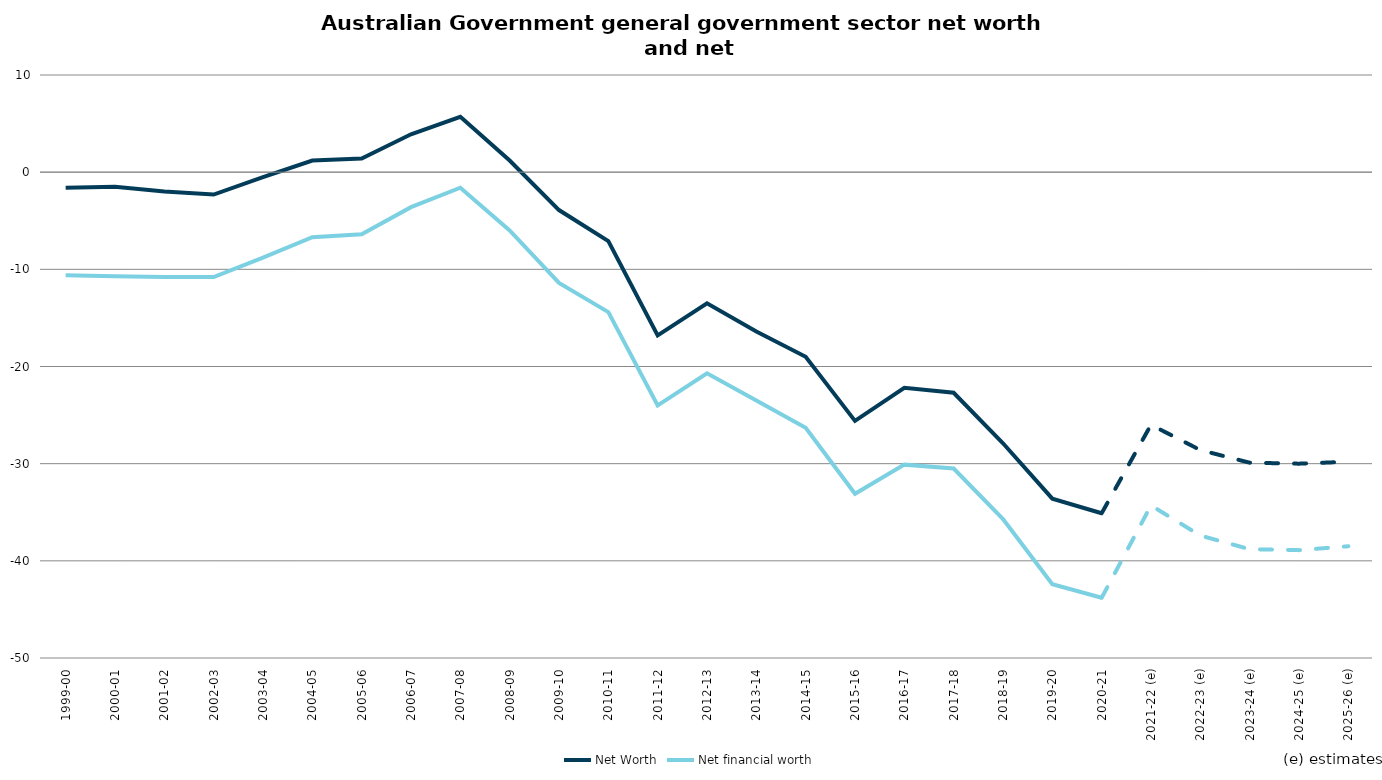
| Category | Net Worth | Net financial worth |
|---|---|---|
| 1999-00 | -1.6 | -10.6 |
| 2000-01 | -1.5 | -10.7 |
| 2001-02 | -2 | -10.8 |
| 2002-03 | -2.3 | -10.8 |
| 2003-04 | -0.5 | -8.8 |
| 2004-05 | 1.2 | -6.7 |
| 2005-06 | 1.4 | -6.4 |
| 2006-07 | 3.9 | -3.6 |
| 2007-08 | 5.7 | -1.6 |
| 2008-09 | 1.2 | -6 |
| 2009-10 | -3.9 | -11.4 |
| 2010-11 | -7.1 | -14.4 |
| 2011-12 | -16.8 | -24 |
| 2012-13 | -13.5 | -20.7 |
| 2013-14 | -16.4 | -23.5 |
| 2014-15 | -19 | -26.3 |
| 2015-16 | -25.6 | -33.1 |
| 2016-17 | -22.2 | -30.1 |
| 2017-18 | -22.7 | -30.5 |
| 2018-19 | -27.9 | -35.7 |
| 2019-20 | -33.6 | -42.4 |
| 2020-21 | -35.1 | -43.8 |
| 2021-22 (e) | -26 | -34.3 |
| 2022-23 (e) | -28.6 | -37.4 |
| 2023-24 (e) | -29.9 | -38.8 |
| 2024-25 (e) | -30 | -38.9 |
| 2025-26 (e) | -29.8 | -38.5 |